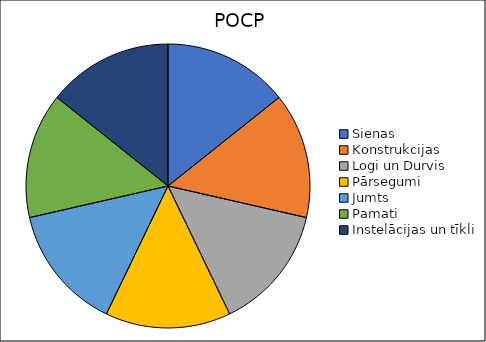
| Category | 0,004 |
|---|---|
| Sienas  | 0.004 |
| Konstrukcijas | 0.004 |
| Logi un Durvis | 0.004 |
| Pārsegumi | 0.004 |
| Jumts | 0.004 |
| Pamati | 0.004 |
| Instelācijas un tīkli | 0.004 |